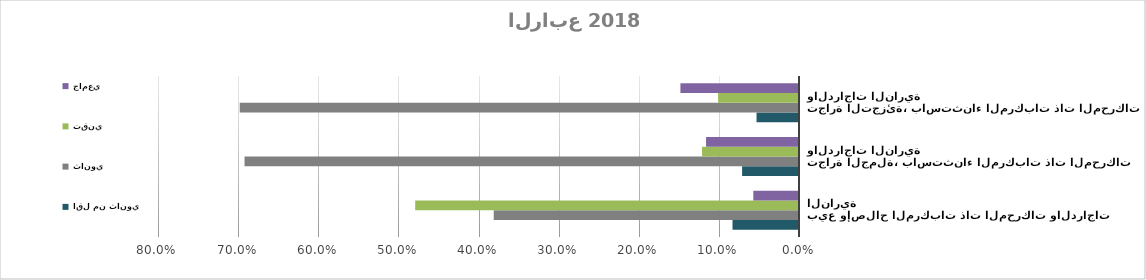
| Category | اقل من ثانوي | ثانوي | تقني | جامعي |
|---|---|---|---|---|
| بيع وإصلاح المركبات ذات المحركات والدراجات النارية | 0.083 | 0.381 | 0.479 | 0.057 |
| تجارة الجملة، باستثناء المركبات ذات المحركات والدراجات النارية | 0.071 | 0.692 | 0.121 | 0.116 |
| تجارة التجزئة، باستثناء المركبات ذات المحركات والدراجات النارية | 0.053 | 0.698 | 0.101 | 0.148 |